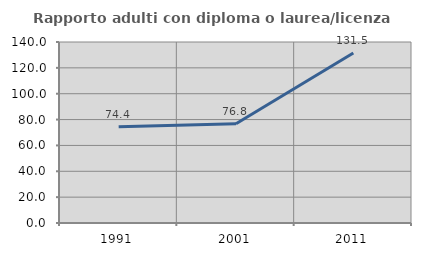
| Category | Rapporto adulti con diploma o laurea/licenza media  |
|---|---|
| 1991.0 | 74.405 |
| 2001.0 | 76.8 |
| 2011.0 | 131.518 |